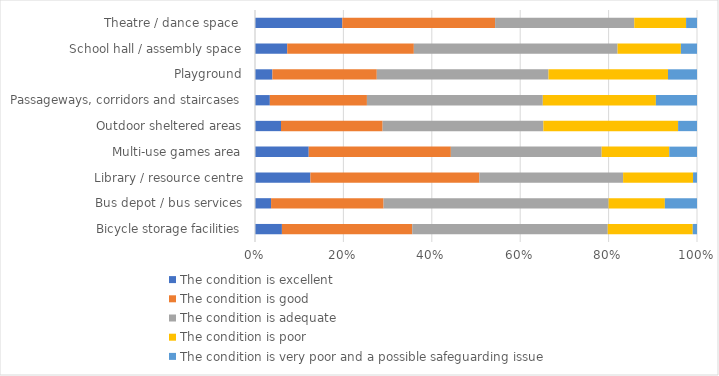
| Category | The condition is excellent | The condition is good | The condition is adequate | The condition is poor | The condition is very poor and a possible safeguarding issue |
|---|---|---|---|---|---|
| Bicycle storage facilities | 0.061 | 0.295 | 0.442 | 0.192 | 0.01 |
| Bus depot / bus services | 0.036 | 0.255 | 0.509 | 0.127 | 0.073 |
| Library / resource centre | 0.125 | 0.382 | 0.325 | 0.158 | 0.009 |
| Multi-use games area | 0.122 | 0.322 | 0.341 | 0.153 | 0.063 |
| Outdoor sheltered areas | 0.059 | 0.23 | 0.364 | 0.305 | 0.043 |
| Passageways, corridors and staircases | 0.034 | 0.22 | 0.398 | 0.256 | 0.093 |
| Playground | 0.039 | 0.236 | 0.388 | 0.27 | 0.066 |
| School hall / assembly space | 0.073 | 0.286 | 0.461 | 0.143 | 0.036 |
| Theatre / dance space  | 0.198 | 0.346 | 0.315 | 0.117 | 0.025 |